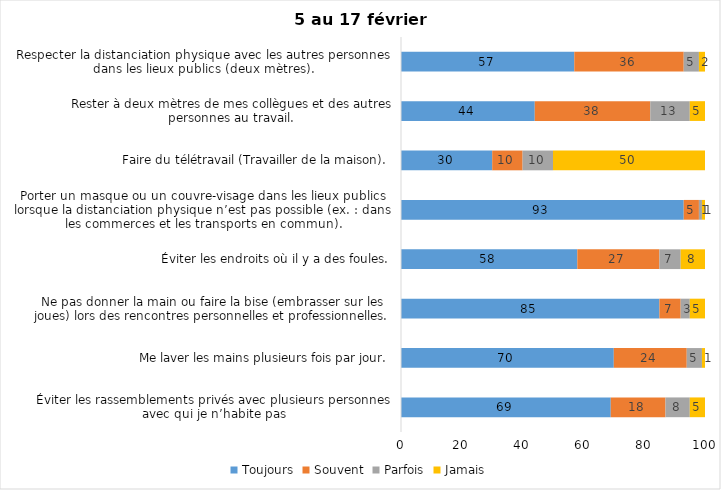
| Category | Toujours | Souvent | Parfois | Jamais |
|---|---|---|---|---|
| Éviter les rassemblements privés avec plusieurs personnes avec qui je n’habite pas | 69 | 18 | 8 | 5 |
| Me laver les mains plusieurs fois par jour. | 70 | 24 | 5 | 1 |
| Ne pas donner la main ou faire la bise (embrasser sur les joues) lors des rencontres personnelles et professionnelles. | 85 | 7 | 3 | 5 |
| Éviter les endroits où il y a des foules. | 58 | 27 | 7 | 8 |
| Porter un masque ou un couvre-visage dans les lieux publics lorsque la distanciation physique n’est pas possible (ex. : dans les commerces et les transports en commun). | 93 | 5 | 1 | 1 |
| Faire du télétravail (Travailler de la maison). | 30 | 10 | 10 | 50 |
| Rester à deux mètres de mes collègues et des autres personnes au travail. | 44 | 38 | 13 | 5 |
| Respecter la distanciation physique avec les autres personnes dans les lieux publics (deux mètres). | 57 | 36 | 5 | 2 |